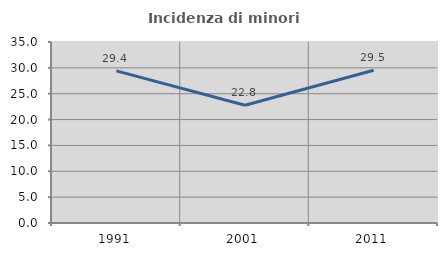
| Category | Incidenza di minori stranieri |
|---|---|
| 1991.0 | 29.412 |
| 2001.0 | 22.772 |
| 2011.0 | 29.54 |